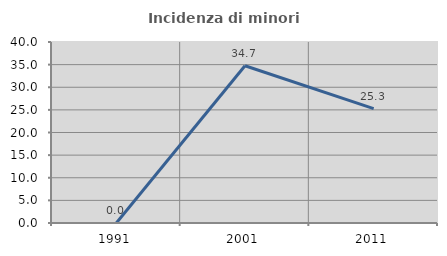
| Category | Incidenza di minori stranieri |
|---|---|
| 1991.0 | 0 |
| 2001.0 | 34.746 |
| 2011.0 | 25.263 |